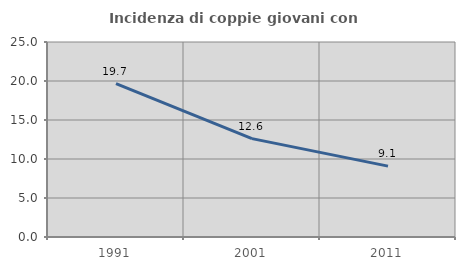
| Category | Incidenza di coppie giovani con figli |
|---|---|
| 1991.0 | 19.67 |
| 2001.0 | 12.614 |
| 2011.0 | 9.086 |